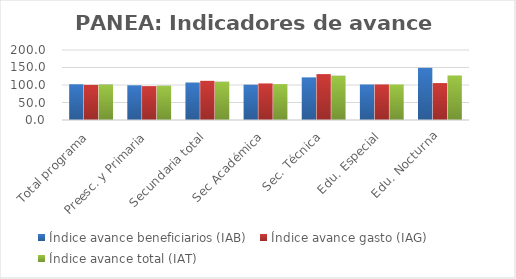
| Category | Índice avance beneficiarios (IAB)  | Índice avance gasto (IAG) | Índice avance total (IAT)  |
|---|---|---|---|
| Total programa | 102.124 | 100.372 | 101.248 |
| Preesc. y Primaria | 99.128 | 96.833 | 97.981 |
| Secundaria total | 106.887 | 111.88 | 109.383 |
| Sec Académica | 100.866 | 104.483 | 102.675 |
| Sec. Técnica | 121.826 | 131.147 | 126.486 |
| Edu. Especial | 101.556 | 101.653 | 101.605 |
| Edu. Nocturna | 148.992 | 105.539 | 127.265 |